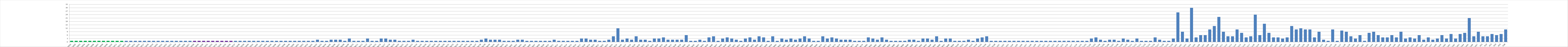
| Category | Series 0 |
|---|---|
| AW01 | 1 |
| AW02 | 1 |
| AW03 | 1 |
| AW04 | 1 |
| AW05 | 1 |
| AW06 | 1 |
| AW07 | 1 |
| AW08 | 1 |
| AW09 | 1 |
| AW10 | 1 |
| AW11 | 1 |
| AW12 | 1 |
| AW13 | 1 |
| AW14 | 1 |
| AW15 | 1 |
| AW16 | 1 |
| AW17 | 1 |
| AW18 | 1 |
| AW19 | 1 |
| AW20 | 1 |
| AW21 | 1 |
| AW22 | 1 |
| AW23 | 1 |
| AW24 | 1 |
| AW25 | 1 |
| AW26 | 1 |
| AW27 | 1 |
| AW28 | 1 |
| AW29 | 1 |
| AW30 | 1 |
| AW31 | 1 |
| AW32 | 1 |
| AW33 | 1 |
| AW34 | 1 |
| AW35 | 1 |
| AW36 | 1 |
| AW37 | 1 |
| AW38 | 1 |
| AW39 | 1 |
| AW40 | 1 |
| AW41 | 1 |
| AW42 | 1 |
| AW43 | 1 |
| AW44 | 1 |
| AW45 | 1 |
| AW46 | 1 |
| AW47 | 1 |
| AW48 | 1 |
| AW49 | 1 |
| AW50 | 1 |
| AW51 | 1 |
| AW52 | 1 |
| AW53 | 1 |
| BW01 | 1 |
| BW02 | 2 |
| BW03 | 1 |
| BW04 | 1 |
| BW05 | 2 |
| BW06 | 2 |
| BW07 | 2 |
| BW08 | 1 |
| BW09 | 3 |
| BW10 | 1 |
| BW11 | 1 |
| BW12 | 1 |
| BW13 | 3 |
| BW14 | 1 |
| BW15 | 1 |
| BW16 | 3 |
| BW17 | 3 |
| BW18 | 2 |
| BW19 | 2 |
| BW20 | 1 |
| BW21 | 1 |
| BW22 | 1 |
| BW23 | 2 |
| BW24 | 1 |
| BW25 | 1 |
| BW26 | 1 |
| BW27 | 1 |
| BW28 | 1 |
| BW29 | 1 |
| BW30 | 1 |
| BW31 | 1 |
| BW32 | 1 |
| BW33 | 1 |
| BW34 | 1 |
| BW35 | 1 |
| BW36 | 1 |
| BW37 | 1 |
| BW38 | 2 |
| BW39 | 3 |
| BW40 | 2 |
| BW41 | 2 |
| BW42 | 2 |
| BW43 | 1 |
| CW01 | 1 |
| CW02 | 1 |
| CW03 | 2 |
| CW04 | 2 |
| CW05 | 1 |
| CW06 | 1 |
| CW07 | 1 |
| CW08 | 1 |
| CW09 | 1 |
| CW10 | 1 |
| CW11 | 2 |
| CW12 | 1 |
| CW13 | 1 |
| CW14 | 1 |
| CW15 | 1 |
| CW16 | 1 |
| CW17 | 3 |
| CW18 | 3 |
| CW19 | 2 |
| CW20 | 2 |
| CW21 | 1 |
| CW22 | 1 |
| CW23 | 2 |
| CW24 | 5 |
| CW25 | 12 |
| CW26 | 2 |
| CW27 | 3 |
| CW28 | 2 |
| CW29 | 5 |
| CW30 | 2 |
| CW31 | 2 |
| CW32 | 1 |
| CW33 | 3 |
| CW34 | 3 |
| CW35 | 4 |
| CW36 | 2 |
| CW37 | 2 |
| CW38 | 2 |
| CW39 | 2 |
| CW40 | 6 |
| CW41 | 1 |
| CW42 | 1 |
| CW43 | 2 |
| CW44 | 1 |
| CW45 | 4 |
| CW46 | 5 |
| CW47 | 1 |
| CW48 | 3 |
| CW49 | 4 |
| CW50 | 3 |
| CW51 | 2 |
| CW52 | 1 |
| CW53 | 3 |
| CW54 | 4 |
| CW55 | 2 |
| CW56 | 5 |
| CW57 | 4 |
| CW58 | 1 |
| CW59 | 5 |
| CW60 | 1 |
| CW61 | 3 |
| CW62 | 2 |
| CW63 | 3 |
| CW64 | 2 |
| CW65 | 3 |
| CW66 | 5 |
| CW67 | 3 |
| CW68 | 1 |
| CW69 | 1 |
| CW70 | 5 |
| CW71 | 3 |
| CW72 | 4 |
| CW73 | 3 |
| CW74 | 2 |
| CW75 | 2 |
| CW76 | 2 |
| CW77 | 1 |
| CW78 | 1 |
| CW79 | 1 |
| CW80 | 4 |
| CW81 | 3 |
| CW82 | 2 |
| CW83 | 4 |
| CW84 | 2 |
| CW85 | 1 |
| CW86 | 1 |
| CW87 | 1 |
| CW88 | 1 |
| CW89 | 2 |
| CW90 | 2 |
| CW91 | 1 |
| CW92 | 3 |
| CW93 | 3 |
| CW94 | 2 |
| CW95 | 5 |
| CW96 | 1 |
| CW97 | 3 |
| CW98 | 3 |
| CW99 | 1 |
| CW100 | 1 |
| CW101 | 1 |
| CW102 | 2 |
| CW103 | 1 |
| CW104 | 3 |
| CW105 | 4 |
| CW106 | 5 |
| CW107 | 1 |
| CW108 | 1 |
| A.U01 | 1 |
| A.U02 | 1 |
| A.U03 | 1 |
| A.U04 | 1 |
| A.U05 | 1 |
| A.U06 | 1 |
| A.U07 | 1 |
| A.U08 | 1 |
| A.U09 | 1 |
| A.U10 | 1 |
| A.U11 | 1 |
| A.U12 | 1 |
| A.U13 | 1 |
| A.U14 | 1 |
| A.U15 | 1 |
| A.U16 | 1 |
| A.U17 | 1 |
| A.U18 | 1 |
| A.U19 | 1 |
| B.U01 | 1 |
| B.U02 | 3 |
| B.U03 | 4 |
| B.U04 | 2 |
| B.U05 | 1 |
| B.U06 | 2 |
| B.U07 | 2 |
| B.U08 | 1 |
| B.U09 | 3 |
| B.U10 | 2 |
| B.U11 | 1 |
| B.U12 | 3 |
| B.U13 | 1 |
| B.U14 | 1 |
| B.U15 | 1 |
| B.U16 | 4 |
| B.U17 | 2 |
| B.U18 | 1 |
| B.U19 | 1 |
| B.U20 | 3 |
| C.U01 | 26 |
| C.U02 | 9 |
| C.U03 | 3 |
| C.U04 | 30 |
| C.U05 | 4 |
| C.U06 | 6 |
| C.U07 | 6 |
| C.U08 | 11 |
| C.U09 | 14 |
| C.U10 | 22 |
| C.U11 | 9 |
| C.U12 | 5 |
| C.U13 | 5 |
| C.U14 | 11 |
| C.U15 | 8 |
| C.U16 | 4 |
| C.U17 | 5 |
| C.U18 | 24 |
| C.U19 | 6 |
| C.U20 | 16 |
| C.U21 | 8 |
| C.U22 | 4 |
| C.U23 | 4 |
| C.U24 | 3 |
| C.U25 | 4 |
| C.U26 | 14 |
| C.U27 | 11 |
| C.U28 | 12 |
| C.U29 | 11 |
| C.U30 | 11 |
| C.U31 | 4 |
| C.U32 | 9 |
| C.U33 | 2 |
| C.U34 | 1 |
| C.U35 | 11 |
| C.U36 | 1 |
| C.U37 | 10 |
| C.U38 | 9 |
| C.U39 | 5 |
| C.U40 | 3 |
| C.U41 | 6 |
| C.U42 | 1 |
| C.U43 | 8 |
| C.U44 | 9 |
| C.U45 | 6 |
| C.U46 | 4 |
| C.U47 | 4 |
| C.U48 | 6 |
| C.U49 | 4 |
| C.U50 | 9 |
| C.U51 | 3 |
| C.U52 | 4 |
| C.U53 | 3 |
| C.U54 | 6 |
| C.U55 | 2 |
| C.U56 | 4 |
| C.U57 | 2 |
| C.U58 | 3 |
| C.U59 | 6 |
| C.U60 | 3 |
| C.U61 | 7 |
| C.U62 | 3 |
| C.U63 | 7 |
| C.U64 | 8 |
| C.U65 | 21 |
| C.U66 | 5 |
| C.U67 | 9 |
| K01 | 5 |
| K02 | 5 |
| K03 | 7 |
| K04 | 6 |
| K05 | 7 |
| K06 | 11 |